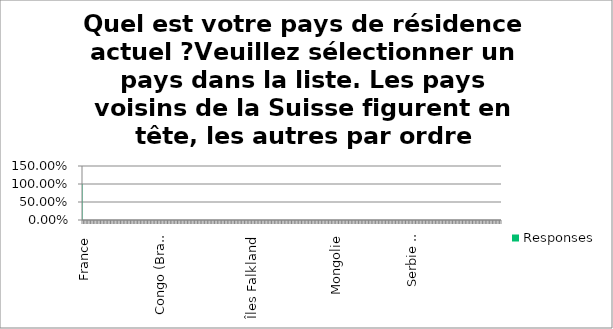
| Category | Responses |
|---|---|
| France | 1 |
| Italie | 0 |
| Allemagne | 0 |
| Autriche | 0 |
| Liechtenstein | 0 |
| Abkhazie | 0 |
| Açores | 0 |
| Adjarie | 0 |
| Afghanistan | 0 |
| Afrique du Nord Espagnole | 0 |
| Afrique du Sud | 0 |
| Albanie | 0 |
| Alderney | 0 |
| Algérie | 0 |
| Andorre | 0 |
| Angola | 0 |
| Anguilla | 0 |
| Antarctique | 0 |
| Antigua-et-Barbuda | 0 |
| Antilles néerlandaises | 0 |
| Arabie saoudite | 0 |
| Argentine | 0 |
| Arménie | 0 |
| Aruba | 0 |
| Ascension | 0 |
| Australie | 0 |
| Azawad | 0 |
| Azerbaïdjan | 0 |
| Bahamas | 0 |
| Bahreïn | 0 |
| Bangladesh | 0 |
| Barbade | 0 |
| Bélarus | 0 |
| Belgique | 0 |
| Belize | 0 |
| Bénin | 0 |
| Berlin ouest | 0 |
| Bermudes | 0 |
| Bhoutan | 0 |
| Biafra | 0 |
| Bolivie | 0 |
| Bonaire, Saint Eustatius et Saba | 0 |
| Bosnie et Herzégovine | 0 |
| Botswana | 0 |
| Brésil | 0 |
| Brunéi Darussalam | 0 |
| Bulgarie | 0 |
| Burkina Faso | 0 |
| Burundi | 0 |
| Cabo Verde | 0 |
| Cambodge | 0 |
| Cameroun | 0 |
| Canada | 0 |
| Chili | 0 |
| Chine | 0 |
| Chypre | 0 |
| Cité du Vatican | 0 |
| Colombie | 0 |
| Comores | 0 |
| Congo (Brazzaville) | 0 |
| Congo (Kinshasa) | 0 |
| Corée (Nord) | 0 |
| Corée (Sud) | 0 |
| Costa Rica | 0 |
| Côte d'Ivoire | 0 |
| Croatie | 0 |
| Cuba | 0 |
| Curaçao | 0 |
| Daghestan | 0 |
| Danemark | 0 |
| Djibouti | 0 |
| Dominique | 0 |
| Égypte | 0 |
| El Salvador | 0 |
| Émirats arabes unis | 0 |
| Équateur | 0 |
| Érythrée | 0 |
| Espagne | 0 |
| Estonie | 0 |
| Eswatini | 0 |
| États-Unis | 0 |
| Éthiopie | 0 |
| Fidji | 0 |
| Finlande | 0 |
| Gabon | 0 |
| Gambie | 0 |
| Géorgie | 0 |
| Géorgie du Sud et Îles Sandwich du Sud | 0 |
| Ghana | 0 |
| Gibraltar | 0 |
| Grèce | 0 |
| Grenade | 0 |
| Groenland | 0 |
| Guadeloupe | 0 |
| Guam | 0 |
| Guatemala | 0 |
| Guernesey | 0 |
| Guinée | 0 |
| Guinée équatoriale | 0 |
| Guinée-Bissau | 0 |
| Guyana | 0 |
| Guyane Française | 0 |
| Haïti | 0 |
| Hawaii | 0 |
| Honduras | 0 |
| Hong Kong | 0 |
| Hongrie | 0 |
| Île Bouvet | 0 |
| Île Christmas (Australie) | 0 |
| Île de Man | 0 |
| Île Johnston | 0 |
| Île Norfolk | 0 |
| Île Wake | 0 |
| Îles Canaries | 0 |
| Îles Cayman | 0 |
| Îles Cocos (Keeling) | 0 |
| Îles Cook | 0 |
| Îles d'Aland | 0 |
| Îles Falkland | 0 |
| Îles Féroé | 0 |
| Îles Marshall | 0 |
| Îles Midway | 0 |
| Îles mineures éloignées des États-Unis | 0 |
| Îles Pitcairn | 0 |
| Îles Salomon | 0 |
| Îles Turques et Caïques | 0 |
| Îles Vierges américaines | 0 |
| Îles Vierges britanniques | 0 |
| Îles-Heard-et-McDonald | 0 |
| Inde | 0 |
| Indochine française | 0 |
| Indonésie | 0 |
| Ingouchie | 0 |
| Irak | 0 |
| Iran | 0 |
| Irlande | 0 |
| Islande | 0 |
| Israël | 0 |
| Jamaïque | 0 |
| Japon | 0 |
| Jersey | 0 |
| Jordanie | 0 |
| Kabardino-Balkarie | 0 |
| Karatchaïévo-Tcherkessie | 0 |
| Kazakhstan | 0 |
| Kenya | 0 |
| Kirghizistan | 0 |
| Kiribati | 0 |
| Kosovo | 0 |
| Koweït | 0 |
| Laos | 0 |
| Lesotho | 0 |
| Lettonie | 0 |
| Liban | 0 |
| Libéria | 0 |
| Libye | 0 |
| Lituanie | 0 |
| Luxembourg | 0 |
| Macao | 0 |
| Macédoine du Nord | 0 |
| Madagascar | 0 |
| Madère | 0 |
| Malaisie | 0 |
| Malawi | 0 |
| Maldives | 0 |
| Mali | 0 |
| Malte | 0 |
| Mariannes du Nord | 0 |
| Maroc | 0 |
| Martinique | 0 |
| Maurice | 0 |
| Mauritanie | 0 |
| Mayotte | 0 |
| Mexique | 0 |
| Micronésie | 0 |
| Moldova | 0 |
| Monaco | 0 |
| Mongolie | 0 |
| Monténégro | 0 |
| Montserrat | 0 |
| Mozambique | 0 |
| Myanmar | 0 |
| Namibie | 0 |
| Nauru | 0 |
| Népal | 0 |
| Nicaragua | 0 |
| Niger | 0 |
| Nigéria | 0 |
| Nioué | 0 |
| Norvège | 0 |
| Nouvelle-Calédonie | 0 |
| Nouvelle-Zélande | 0 |
| Oman | 0 |
| Ossétie du Sud | 0 |
| Ossétie-du-Nord-Alanie | 0 |
| Ouganda | 0 |
| Ouzbékistan | 0 |
| Pakistan | 0 |
| Palaos | 0 |
| Palestine | 0 |
| Panama | 0 |
| Papouasie-Nouvelle-Guinée | 0 |
| Paraguay | 0 |
| Pays-Bas | 0 |
| Pérou | 0 |
| Philippines | 0 |
| Pologne | 0 |
| Polynésie française | 0 |
| Porto Rico | 0 |
| Portugal | 0 |
| Province de Voïvodine | 0 |
| Qatar | 0 |
| République arabe unie | 0 |
| République centrafricaine | 0 |
| République démocratique allemande | 0 |
| République dominicaine | 0 |
| Réunion | 0 |
| Roumanie | 0 |
| Royaume-Uni | 0 |
| Russie | 0 |
| Rwanda | 0 |
| Sahara Occidental | 0 |
| Saint-Barthélemy | 0 |
| Saint-Kitts-et-Nevis | 0 |
| Saint-Marin | 0 |
| Saint-Martin (France) | 0 |
| Saint-Pierre-et-Miquelon | 0 |
| Saint-Vincent-et-les Grenadines | 0 |
| Sainte-Hélène | 0 |
| Sainte-Lucie | 0 |
| Samoa | 0 |
| Samoa américaines | 0 |
| Sao Tomé-et-Principe | 0 |
| Sarawak | 0 |
| Sénégal | 0 |
| Serbie | 0 |
| Serbie centrale | 0 |
| Serbie-et-Monténégro | 0 |
| Sercq | 0 |
| Seychelles | 0 |
| Sierra Leone | 0 |
| Sikkim | 0 |
| Singapour | 0 |
| Sint Maarten (Pays-Bas) | 0 |
| Slovaquie | 0 |
| Slovénie | 0 |
| Somalie | 0 |
| Soudan | 0 |
| Soudan du Sud | 0 |
| Sri Lanka | 0 |
| Suède | 0 |
| Suriname | 0 |
| Svalbard et Île Jan Mayen | 0 |
| Syrie | 0 |
| Tadjikistan | 0 |
| Taïwan (Taipei chinois) | 0 |
| Tanganyika | 0 |
| Tanzanie | 0 |
| Tchad | 0 |
| Tchécoslovaquie | 0 |
| Tchéquie | 0 |
| Tchétchénie | 0 |
| Terres australes et antarctiques françaises | 0 |
| Territoires britanniques dans l'océan indien | 0 |
| Thaïlande | 0 |
| Tibet | 0 |
| Timor (Portugal) | 0 |
| Timor-Leste | 0 |
| Togo | 0 |
| Tokélau | 0 |
| Tonga | 0 |
| Trieste | 0 |
| Trinité-et-Tobago | 0 |
| Tristan da Cunha | 0 |
| Tunisie | 0 |
| Turkménistan | 0 |
| Turquie | 0 |
| Tuvalu | 0 |
| Ukraine | 0 |
| Union des Républiques Socialistes Soviétiques | 0 |
| Uruguay | 0 |
| Vanuatu | 0 |
| Venezuela | 0 |
| Viet-Nam du Nord | 0 |
| Viêt-Nam du Sud | 0 |
| Vietnam | 0 |
| Wallis-et-Futuna | 0 |
| Yémen | 0 |
| Yémen du nord | 0 |
| Yémen du Sud | 0 |
| Yougoslavie | 0 |
| Zambie | 0 |
| Zanzibar | 0 |
| Zimbabwe | 0 |